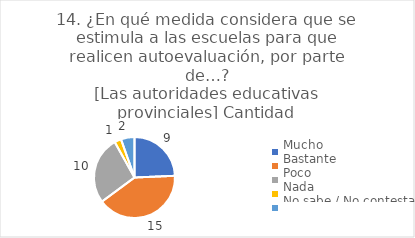
| Category | 14. ¿En qué medida considera que se estimula a las escuelas para que realicen autoevaluación, por parte de…?
[Las autoridades educativas provinciales] |
|---|---|
| Mucho  | 0.243 |
| Bastante  | 0.405 |
| Poco  | 0.27 |
| Nada  | 0.027 |
| No sabe / No contesta | 0.054 |